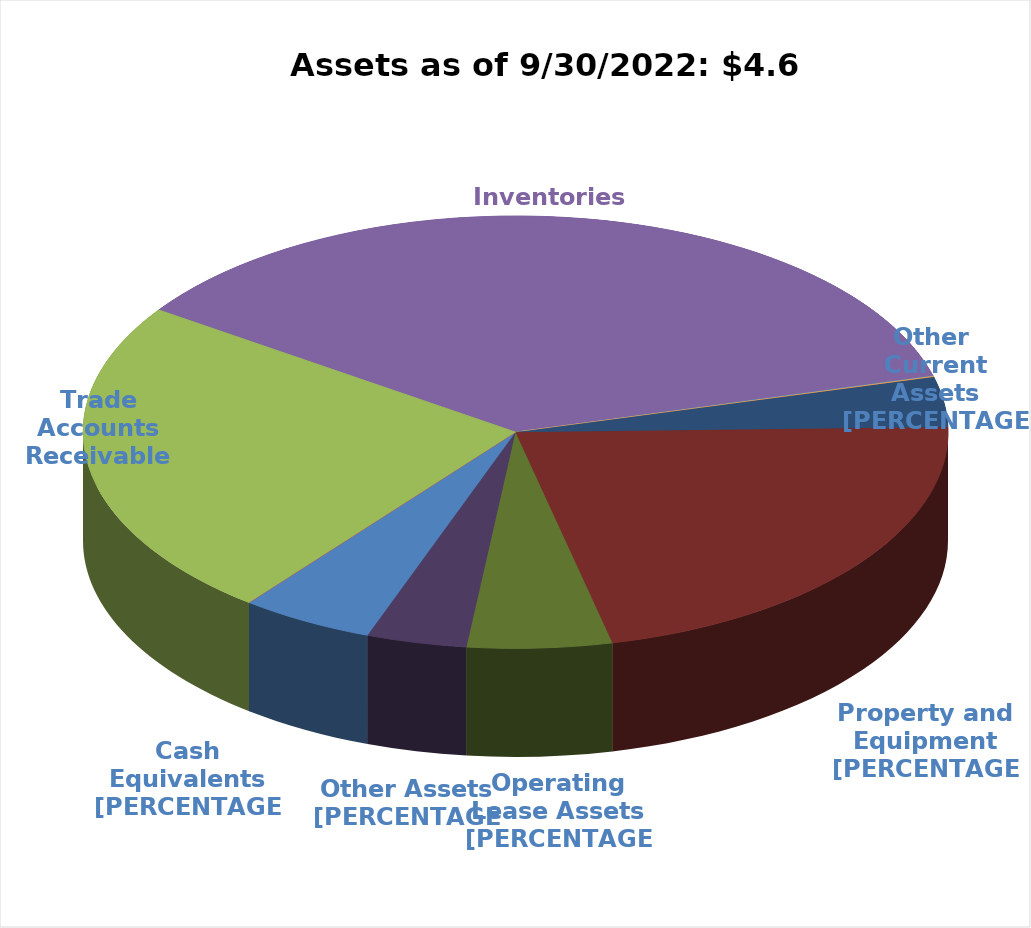
| Category | Series 0 |
|---|---|
|   Cash and cash equivalents | 231.5 |
|   Marketable  securities | 0 |
|   Trade accounts receivable, net of allowance for credit losses | 1110.6 |
|   Inventories | 1678.1 |
|   Deferred income taxes | 0 |
|   Prepaid income taxes | 3.2 |
|   Other current assets | 172.2 |
| Property and equipment, net | 1008.5 |
| Operating lease right-of-use assets | 249.8 |
| Other assets, net | 173.5 |